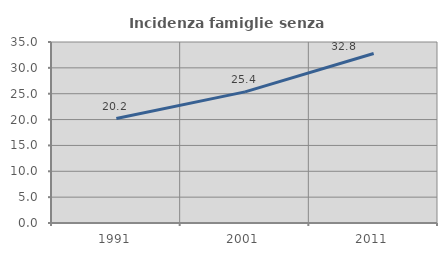
| Category | Incidenza famiglie senza nuclei |
|---|---|
| 1991.0 | 20.204 |
| 2001.0 | 25.359 |
| 2011.0 | 32.769 |